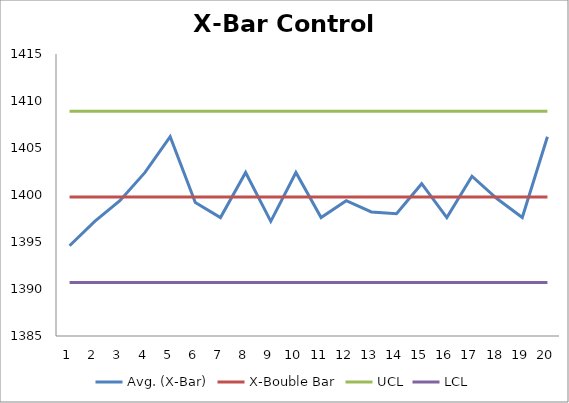
| Category | Avg. (X-Bar) | X-Bouble Bar | UCL | LCL |
|---|---|---|---|---|
| 0 | 1394.6 | 1399.8 | 1408.916 | 1390.684 |
| 1 | 1397.2 | 1399.8 | 1408.916 | 1390.684 |
| 2 | 1399.4 | 1399.8 | 1408.916 | 1390.684 |
| 3 | 1402.4 | 1399.8 | 1408.916 | 1390.684 |
| 4 | 1406.2 | 1399.8 | 1408.916 | 1390.684 |
| 5 | 1399.2 | 1399.8 | 1408.916 | 1390.684 |
| 6 | 1397.6 | 1399.8 | 1408.916 | 1390.684 |
| 7 | 1402.4 | 1399.8 | 1408.916 | 1390.684 |
| 8 | 1397.2 | 1399.8 | 1408.916 | 1390.684 |
| 9 | 1402.4 | 1399.8 | 1408.916 | 1390.684 |
| 10 | 1397.6 | 1399.8 | 1408.916 | 1390.684 |
| 11 | 1399.4 | 1399.8 | 1408.916 | 1390.684 |
| 12 | 1398.2 | 1399.8 | 1408.916 | 1390.684 |
| 13 | 1398 | 1399.8 | 1408.916 | 1390.684 |
| 14 | 1401.2 | 1399.8 | 1408.916 | 1390.684 |
| 15 | 1397.6 | 1399.8 | 1408.916 | 1390.684 |
| 16 | 1402 | 1399.8 | 1408.916 | 1390.684 |
| 17 | 1399.6 | 1399.8 | 1408.916 | 1390.684 |
| 18 | 1397.6 | 1399.8 | 1408.916 | 1390.684 |
| 19 | 1406.2 | 1399.8 | 1408.916 | 1390.684 |